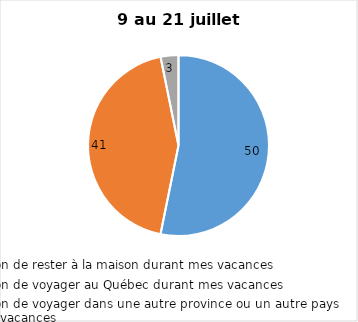
| Category | Series 0 |
|---|---|
| J’ai l’intention de rester à la maison durant mes vacances | 50 |
| J’ai l’intention de voyager au Québec durant mes vacances | 41 |
| J’ai l’intention de voyager dans une autre province ou un autre pays durant mes vacances | 3 |